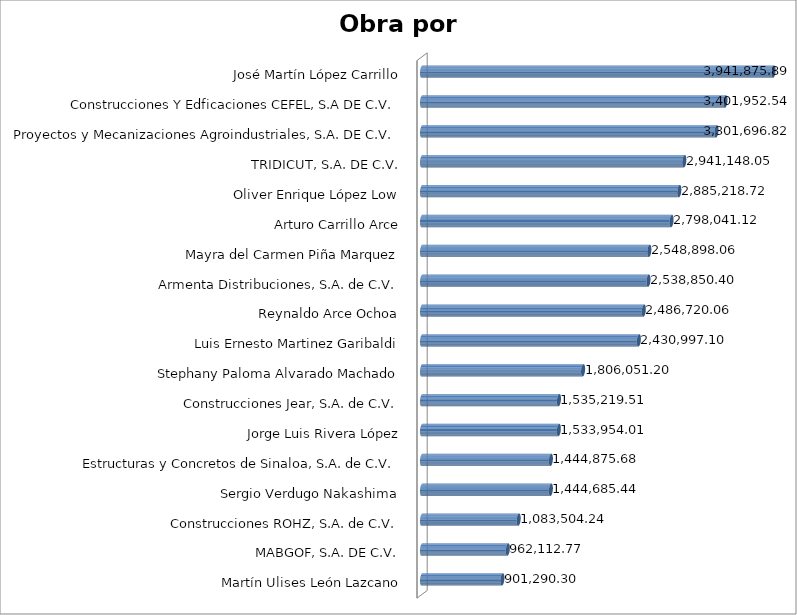
| Category | Suma  |
|---|---|
| Martín Ulises León Lazcano | 901290.3 |
| MABGOF, S.A. DE C.V. | 962112.77 |
| Construcciones ROHZ, S.A. de C.V. | 1083504.24 |
| Sergio Verdugo Nakashima | 1444685.44 |
| Estructuras y Concretos de Sinaloa, S.A. de C.V. | 1444875.68 |
| Jorge Luis Rivera López | 1533954.01 |
| Construcciones Jear, S.A. de C.V. | 1535219.51 |
| Stephany Paloma Alvarado Machado | 1806051.2 |
| Luis Ernesto Martinez Garibaldi | 2430997.1 |
| Reynaldo Arce Ochoa | 2486720.06 |
| Armenta Distribuciones, S.A. de C.V. | 2538850.4 |
| Mayra del Carmen Piña Marquez | 2548898.06 |
| Arturo Carrillo Arce | 2798041.12 |
| Oliver Enrique López Low | 2885218.72 |
| TRIDICUT, S.A. DE C.V. | 2941148.05 |
| Proyectos y Mecanizaciones Agroindustriales, S.A. DE C.V. | 3301696.82 |
| Construcciones Y Edficaciones CEFEL, S.A DE C.V. | 3401952.54 |
| José Martín López Carrillo | 3941875.89 |